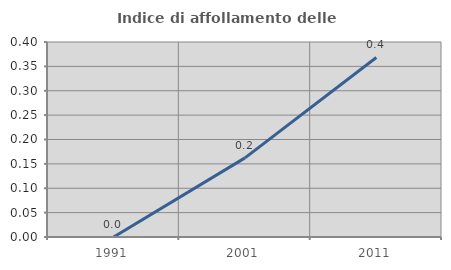
| Category | Indice di affollamento delle abitazioni  |
|---|---|
| 1991.0 | 0 |
| 2001.0 | 0.162 |
| 2011.0 | 0.368 |